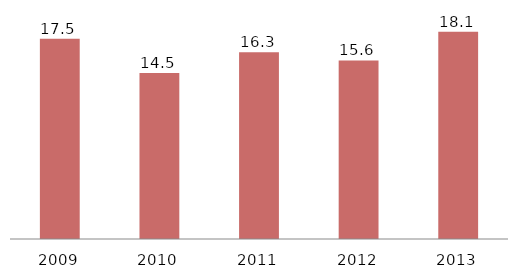
| Category | lkjk |
|---|---|
| 2009.0 | 17.5 |
| 2010.0 | 14.5 |
| 2011.0 | 16.3 |
| 2012.0 | 15.6 |
| 2013.0 | 18.1 |